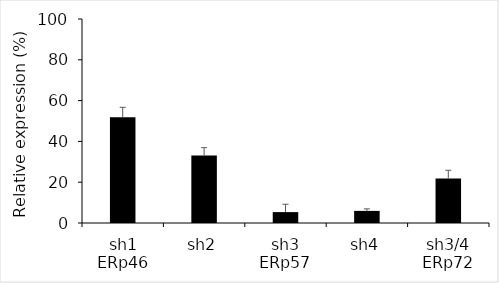
| Category | Series 0 |
|---|---|
| 0 | 51.802 |
| 1 | 33.028 |
| 2 | 5.342 |
| 3 | 5.935 |
| 4 | 21.856 |